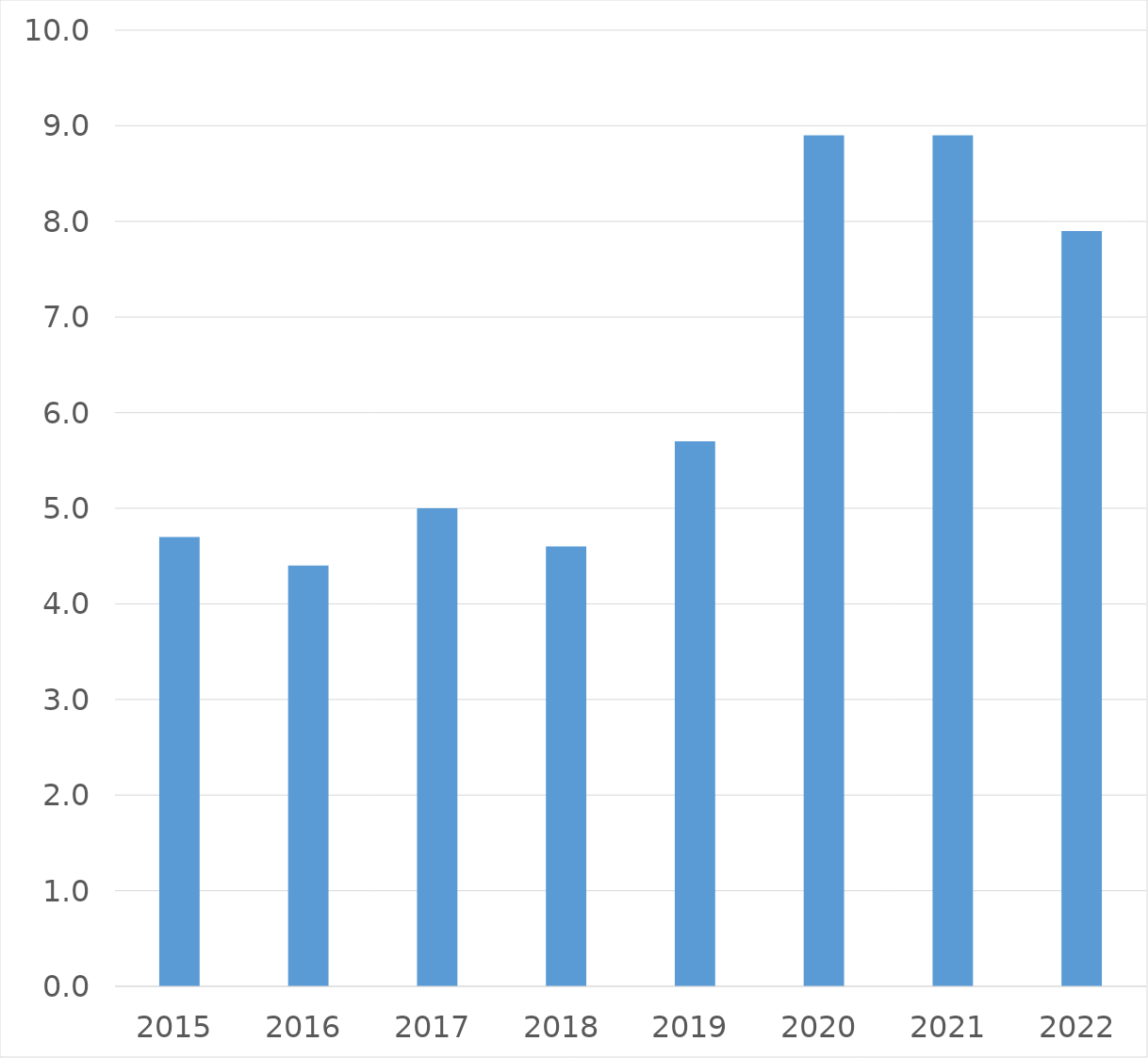
| Category | Series 0 |
|---|---|
| 2015 | 4.7 |
| 2016 | 4.4 |
| 2017 | 5 |
| 2018 | 4.6 |
| 2019 | 5.7 |
| 2020 | 8.9 |
| 2021 | 8.9 |
| 2022 | 7.9 |